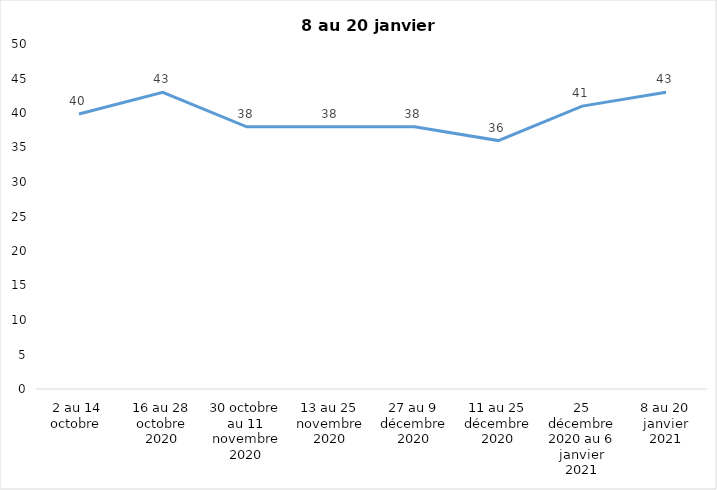
| Category | Toujours aux trois mesures |
|---|---|
| 2 au 14 octobre  | 39.85 |
| 16 au 28 octobre 2020 | 43 |
| 30 octobre au 11 novembre 2020 | 38 |
| 13 au 25 novembre 2020 | 38 |
| 27 au 9 décembre 2020 | 38 |
| 11 au 25 décembre 2020 | 36 |
| 25 décembre 2020 au 6 janvier 2021 | 41 |
| 8 au 20 janvier 2021 | 43 |